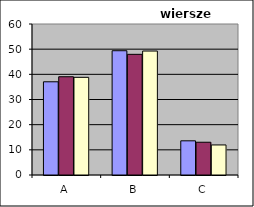
| Category | Series 0 | Series 1 | Series 2 |
|---|---|---|---|
| A | 37.037 | 39.041 | 38.806 |
| B | 49.383 | 47.945 | 49.254 |
| C | 13.58 | 13.014 | 11.94 |